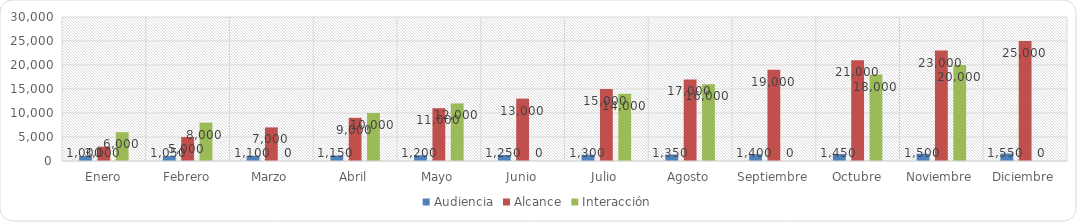
| Category | Audiencia | Alcance | Interacción |
|---|---|---|---|
| Enero | 1000 | 3000 | 6000 |
| Febrero | 1050 | 5000 | 8000 |
| Marzo | 1100 | 7000 | 0 |
| Abril | 1150 | 9000 | 10000 |
| Mayo | 1200 | 11000 | 12000 |
| Junio | 1250 | 13000 | 0 |
| Julio | 1300 | 15000 | 14000 |
| Agosto | 1350 | 17000 | 16000 |
| Septiembre | 1400 | 19000 | 0 |
| Octubre | 1450 | 21000 | 18000 |
| Noviembre | 1500 | 23000 | 20000 |
| Diciembre | 1550 | 25000 | 0 |